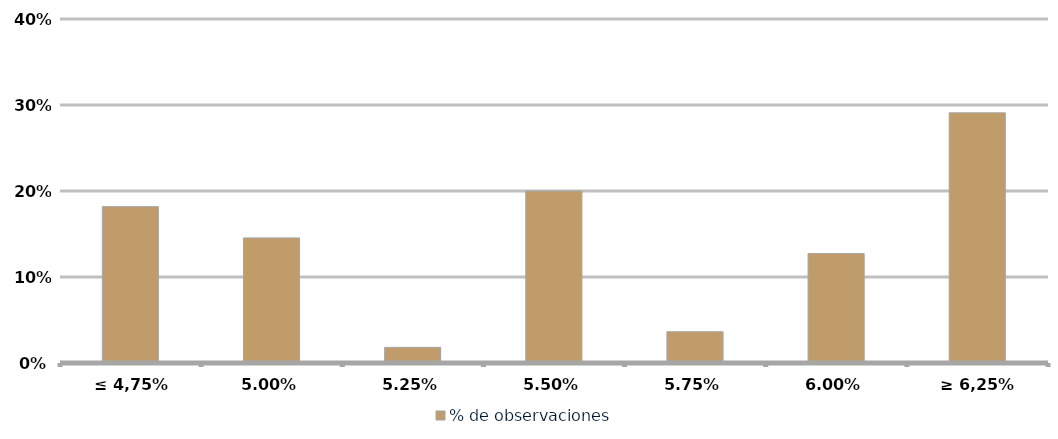
| Category | % de observaciones  |
|---|---|
| ≤ 4,75% | 0.182 |
| 5,00% | 0.145 |
| 5,25% | 0.018 |
| 5,50% | 0.2 |
| 5,75% | 0.036 |
| 6,00% | 0.127 |
| ≥ 6,25% | 0.291 |